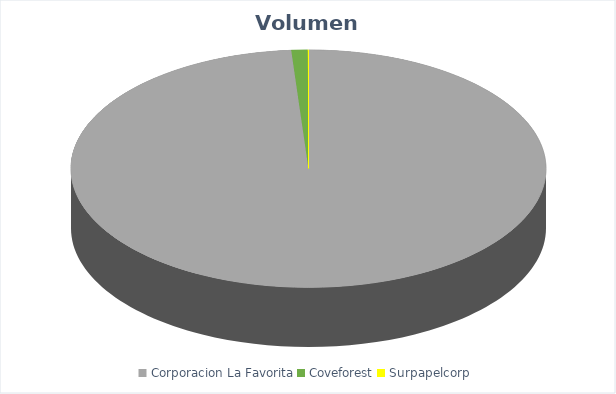
| Category | VOLUMEN ($USD) |
|---|---|
| Corporacion La Favorita | 107021.2 |
| Coveforest | 1201.2 |
| Surpapelcorp | 51 |